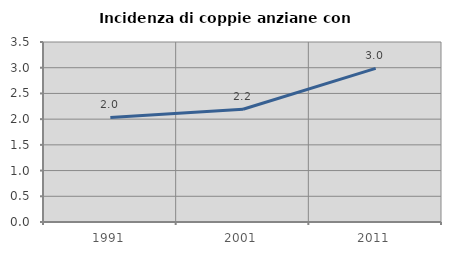
| Category | Incidenza di coppie anziane con figli |
|---|---|
| 1991.0 | 2.033 |
| 2001.0 | 2.191 |
| 2011.0 | 2.986 |